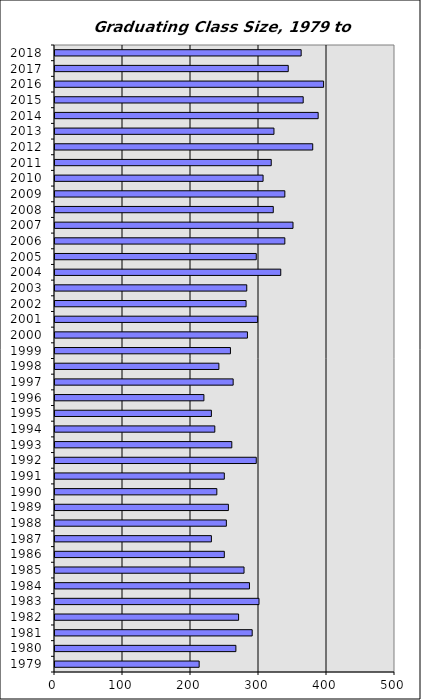
| Category | # Graduates* |
|---|---|
| 1979.0 | 212 |
| 1980.0 | 266 |
| 1981.0 | 290 |
| 1982.0 | 270 |
| 1983.0 | 300 |
| 1984.0 | 286 |
| 1985.0 | 278 |
| 1986.0 | 249 |
| 1987.0 | 230 |
| 1988.0 | 252 |
| 1989.0 | 255 |
| 1990.0 | 238 |
| 1991.0 | 249 |
| 1992.0 | 296 |
| 1993.0 | 260 |
| 1994.0 | 235 |
| 1995.0 | 230 |
| 1996.0 | 219 |
| 1997.0 | 262 |
| 1998.0 | 241 |
| 1999.0 | 258 |
| 2000.0 | 283 |
| 2001.0 | 298 |
| 2002.0 | 281 |
| 2003.0 | 282 |
| 2004.0 | 332 |
| 2005.0 | 296 |
| 2006.0 | 338 |
| 2007.0 | 350 |
| 2008.0 | 321 |
| 2009.0 | 338 |
| 2010.0 | 306 |
| 2011.0 | 318 |
| 2012.0 | 379 |
| 2013.0 | 322 |
| 2014.0 | 387 |
| 2015.0 | 365 |
| 2016.0 | 395 |
| 2017.0 | 343 |
| 2018.0 | 362 |